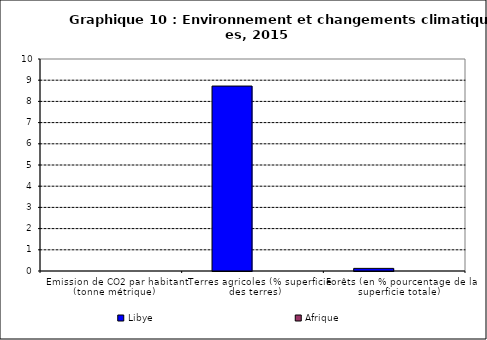
| Category | Libye | Afrique |
|---|---|---|
| Emission de CO2 par habitant (tonne métrique) | 0 | 0 |
| Terres agricoles (% superficie des terres) | 8.724 | 0 |
| Forêts (en % pourcentage de la superficie totale) | 0.123 | 0 |